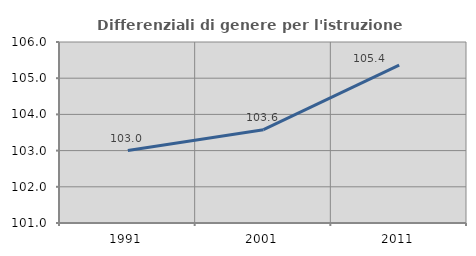
| Category | Differenziali di genere per l'istruzione superiore |
|---|---|
| 1991.0 | 103.003 |
| 2001.0 | 103.577 |
| 2011.0 | 105.361 |